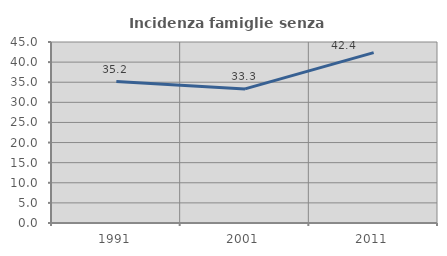
| Category | Incidenza famiglie senza nuclei |
|---|---|
| 1991.0 | 35.159 |
| 2001.0 | 33.333 |
| 2011.0 | 42.361 |